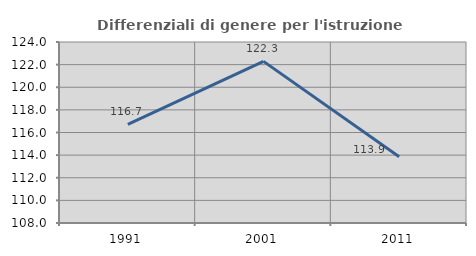
| Category | Differenziali di genere per l'istruzione superiore |
|---|---|
| 1991.0 | 116.712 |
| 2001.0 | 122.288 |
| 2011.0 | 113.863 |